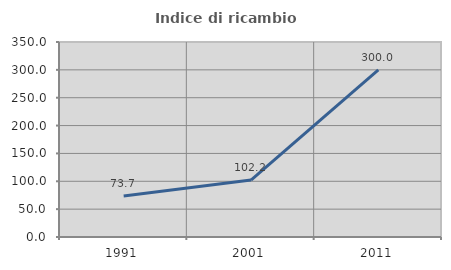
| Category | Indice di ricambio occupazionale  |
|---|---|
| 1991.0 | 73.684 |
| 2001.0 | 102.222 |
| 2011.0 | 300 |